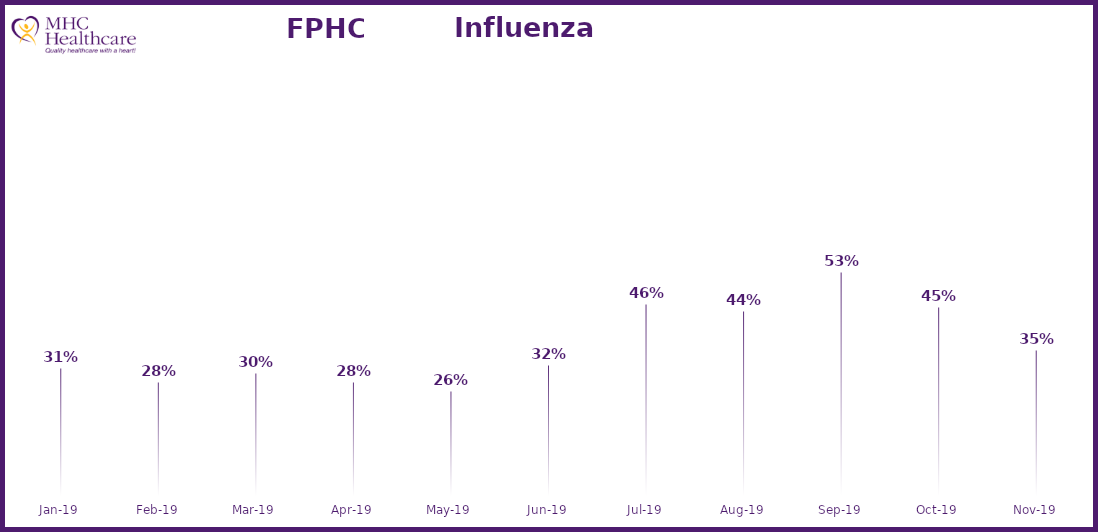
| Category | Online Access to Health Information |
|---|---|
| 2019-01-01 | 0.312 |
| 2019-02-01 | 0.282 |
| 2019-03-01 | 0.302 |
| 2019-04-01 | 0.282 |
| 2019-05-01 | 0.262 |
| 2019-06-01 | 0.319 |
| 2019-07-01 | 0.458 |
| 2019-08-01 | 0.441 |
| 2019-09-01 | 0.529 |
| 2019-10-01 | 0.45 |
| 2019-11-01 | 0.353 |